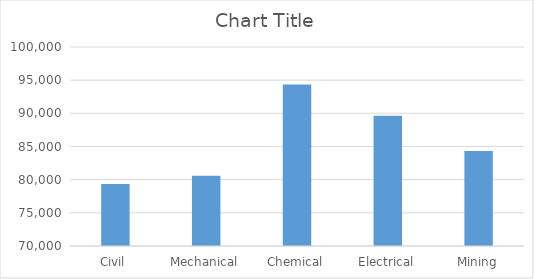
| Category | Series 0 |
|---|---|
| Civil | 79340 |
| Mechanical | 80580 |
| Chemical | 94350 |
| Electrical | 89630 |
| Mining | 84320 |